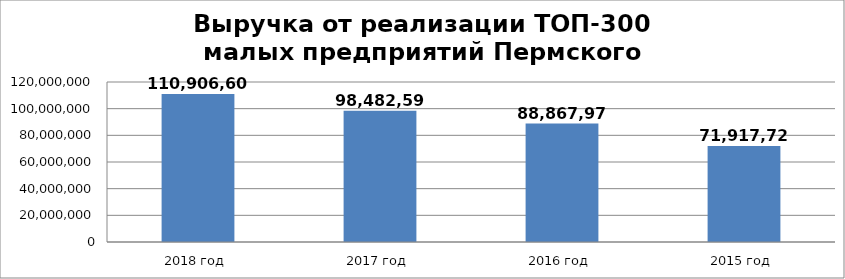
| Category | Series 0 |
|---|---|
| 2018 год | 110906607 |
| 2017 год | 98482592 |
| 2016 год | 88867970 |
| 2015 год | 71917723 |